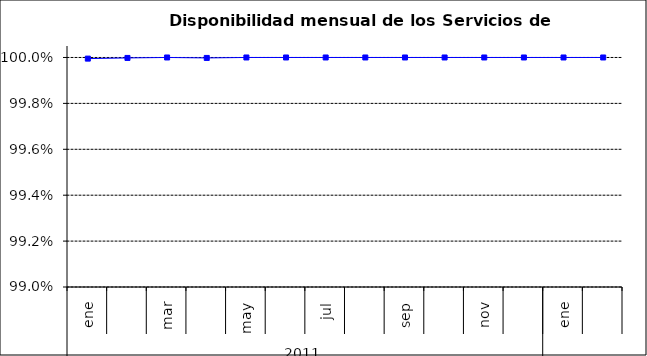
| Category | SCL * |
|---|---|
| 0 | 1 |
| 1 | 1 |
| 2 | 1 |
| 3 | 1 |
| 4 | 1 |
| 5 | 1 |
| 6 | 1 |
| 7 | 1 |
| 8 | 1 |
| 9 | 1 |
| 10 | 1 |
| 11 | 1 |
| 12 | 1 |
| 13 | 1 |